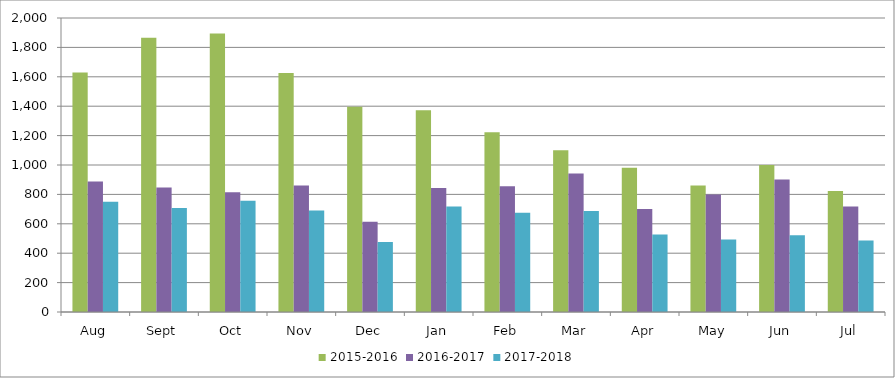
| Category | 2015-2016 | 2016-2017 | 2017-2018 |
|---|---|---|---|
| Aug | 1630 | 888 | 750 |
| Sept | 1865 | 847 | 708 |
| Oct | 1895 | 815 | 756 |
| Nov | 1626 | 861 | 690 |
| Dec | 1397 | 614 | 477 |
| Jan | 1373 | 843 | 717 |
| Feb | 1222 | 855 | 675 |
| Mar | 1100 | 942 | 687 |
| Apr | 981 | 700 | 528 |
| May | 861 | 800 | 494 |
| Jun | 1000 | 901 | 522 |
| Jul | 823 | 718 | 487 |